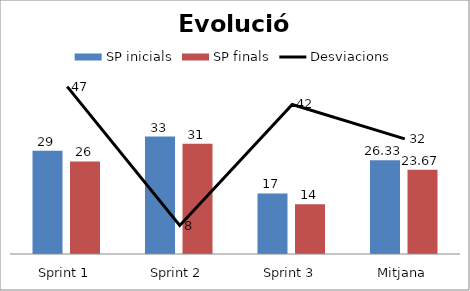
| Category | SP inicials | SP finals |
|---|---|---|
| Sprint 1 | 29 | 26 |
| Sprint 2 | 33 | 31 |
| Sprint 3 | 17 | 14 |
| Mitjana | 26.333 | 23.667 |